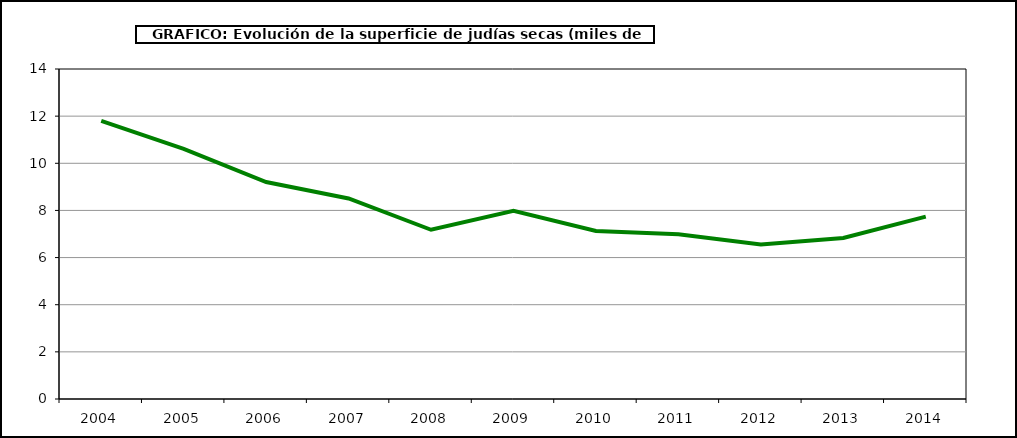
| Category | Superficie |
|---|---|
| 2004.0 | 11.798 |
| 2005.0 | 10.614 |
| 2006.0 | 9.206 |
| 2007.0 | 8.507 |
| 2008.0 | 7.18 |
| 2009.0 | 7.982 |
| 2010.0 | 7.13 |
| 2011.0 | 6.989 |
| 2012.0 | 6.554 |
| 2013.0 | 6.829 |
| 2014.0 | 7.737 |